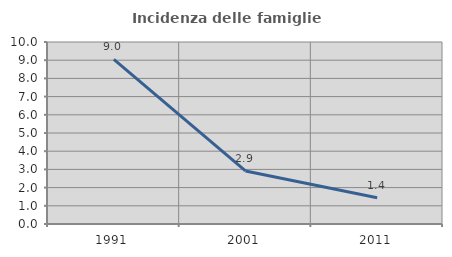
| Category | Incidenza delle famiglie numerose |
|---|---|
| 1991.0 | 9.044 |
| 2001.0 | 2.914 |
| 2011.0 | 1.442 |